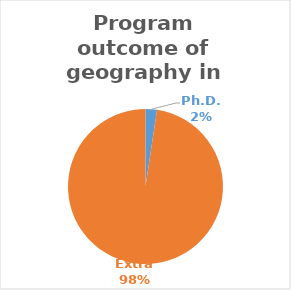
| Category | Series 0 |
|---|---|
| Ph.D. | 1 |
| Extra | 41 |